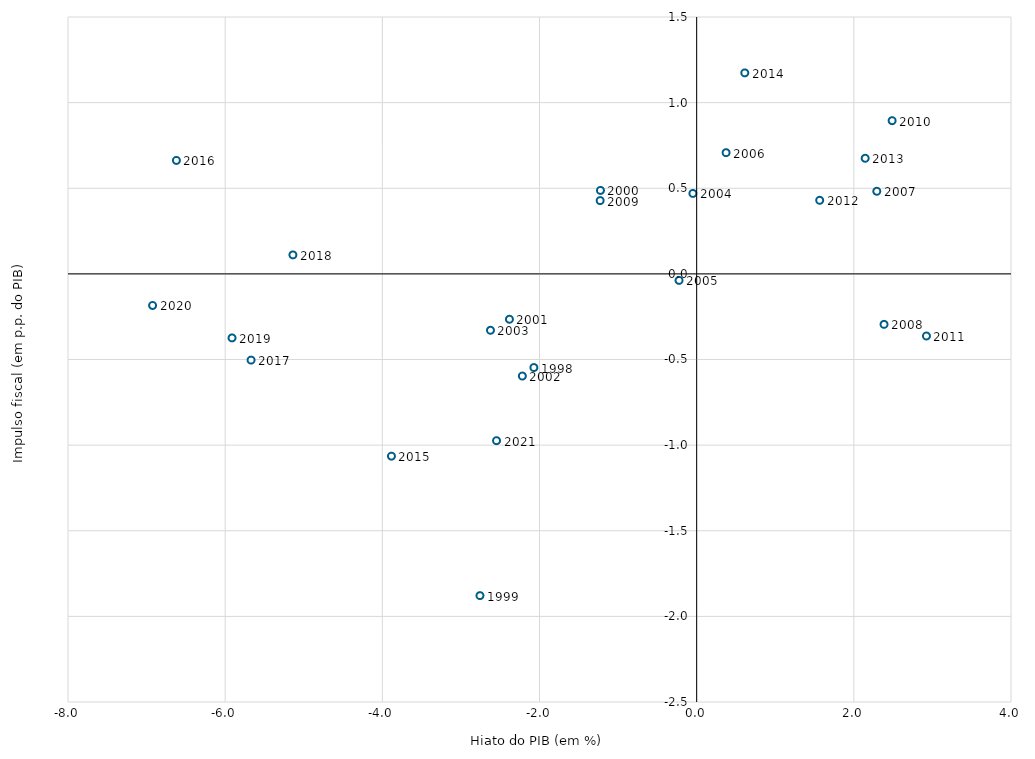
| Category | Orientação da Política Fiscal |
|---|---|
| -2.07143204181639 | -0.547 |
| -2.7576259096457334 | -1.879 |
| -1.2241034306299636 | 0.487 |
| -2.3828215251327167 | -0.265 |
| -2.2181836359362217 | -0.597 |
| -2.623762428040999 | -0.329 |
| -0.048068258995814794 | 0.47 |
| -0.22448758229611787 | -0.038 |
| 0.37443507255201514 | 0.708 |
| 2.291949319045683 | 0.482 |
| 2.3844522082717257 | -0.295 |
| -1.2283148774259511 | 0.428 |
| 2.4871412508014057 | 0.895 |
| 2.9241183504994606 | -0.363 |
| 1.5655179419103549 | 0.43 |
| 2.1442073800294947 | 0.675 |
| 0.612633125396167 | 1.174 |
| -3.8840346612227683 | -1.065 |
| -6.6204433847080075 | 0.663 |
| -5.670277202298635 | -0.504 |
| -5.137971545061049 | 0.111 |
| -5.912608901701555 | -0.374 |
| -6.923491678857707 | -0.185 |
| -2.5467296832249575 | -0.974 |